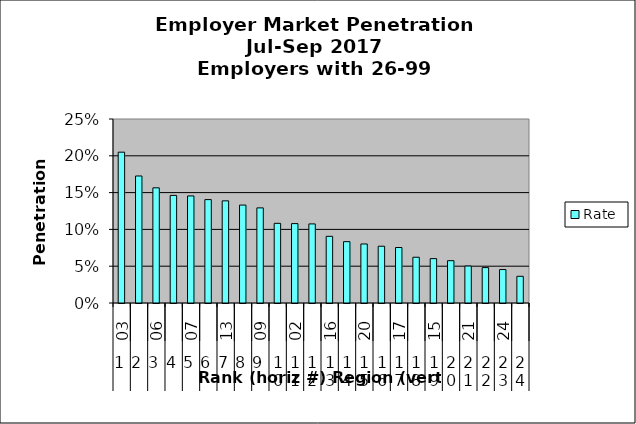
| Category | Rate |
|---|---|
| 0 | 0.205 |
| 1 | 0.173 |
| 2 | 0.156 |
| 3 | 0.146 |
| 4 | 0.145 |
| 5 | 0.14 |
| 6 | 0.139 |
| 7 | 0.133 |
| 8 | 0.129 |
| 9 | 0.108 |
| 10 | 0.108 |
| 11 | 0.107 |
| 12 | 0.091 |
| 13 | 0.083 |
| 14 | 0.08 |
| 15 | 0.077 |
| 16 | 0.075 |
| 17 | 0.062 |
| 18 | 0.06 |
| 19 | 0.057 |
| 20 | 0.05 |
| 21 | 0.048 |
| 22 | 0.045 |
| 23 | 0.036 |